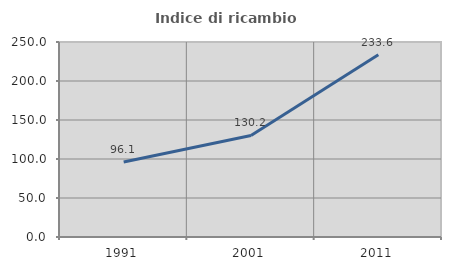
| Category | Indice di ricambio occupazionale  |
|---|---|
| 1991.0 | 96.122 |
| 2001.0 | 130.225 |
| 2011.0 | 233.613 |